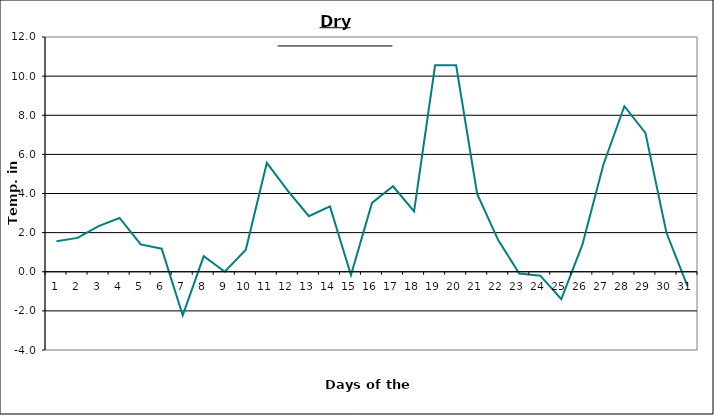
| Category | Series 0 |
|---|---|
| 0 | 1.56 |
| 1 | 1.73 |
| 2 | 2.33 |
| 3 | 2.75 |
| 4 | 1.4 |
| 5 | 1.18 |
| 6 | -2.23 |
| 7 | 0.8 |
| 8 | 0 |
| 9 | 1.13 |
| 10 | 5.57 |
| 11 | 4.13 |
| 12 | 2.84 |
| 13 | 3.34 |
| 14 | -0.17 |
| 15 | 3.52 |
| 16 | 4.37 |
| 17 | 3.08 |
| 18 | 10.55 |
| 19 | 10.55 |
| 20 | 3.98 |
| 21 | 1.62 |
| 22 | -0.09 |
| 23 | -0.2 |
| 24 | -1.4 |
| 25 | 1.37 |
| 26 | 5.47 |
| 27 | 8.46 |
| 28 | 7.1 |
| 29 | 1.99 |
| 30 | -0.74 |